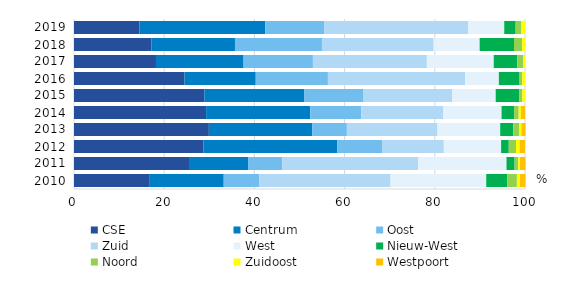
| Category | CSE | Centrum | Oost | Zuid  | West  | Nieuw-West | Noord | Zuidoost | Westpoort |
|---|---|---|---|---|---|---|---|---|---|
| 2010.0 | 16.8 | 16.4 | 7.9 | 29.1 | 21.2 | 4.7 | 2.1 | 0.7 | 1.2 |
| 2011.0 | 25.5 | 13.1 | 7.6 | 30.1 | 19.6 | 1.8 | 0.8 | 0.4 | 1.2 |
| 2012.0 | 28.7 | 29.7 | 9.9 | 13.7 | 12.7 | 1.7 | 1.6 | 0.8 | 1.2 |
| 2013.0 | 29.9 | 22.9 | 7.7 | 20.1 | 13.9 | 2.9 | 1.3 | 0.5 | 0.9 |
| 2014.0 | 29.3 | 23.1 | 11.3 | 18.2 | 12.9 | 2.8 | 1 | 0.5 | 0.9 |
| 2015.0 | 28.9 | 22.2 | 13.1 | 19.7 | 9.6 | 5.2 | 0.7 | 0.6 | 0 |
| 2016.0 | 24.5 | 15.8 | 16 | 30.4 | 7.5 | 4.6 | 0.6 | 0.6 | 0 |
| 2017.0 | 18.177 | 19.423 | 15.378 | 25.257 | 14.834 | 5.226 | 1.266 | 0.44 | 0 |
| 2018.0 | 17.145 | 18.548 | 19.283 | 24.779 | 10.186 | 7.622 | 1.813 | 0.623 | 0 |
| 2019.0 | 14.52 | 27.876 | 13.075 | 31.887 | 8.037 | 2.533 | 1.253 | 0.818 | 0 |